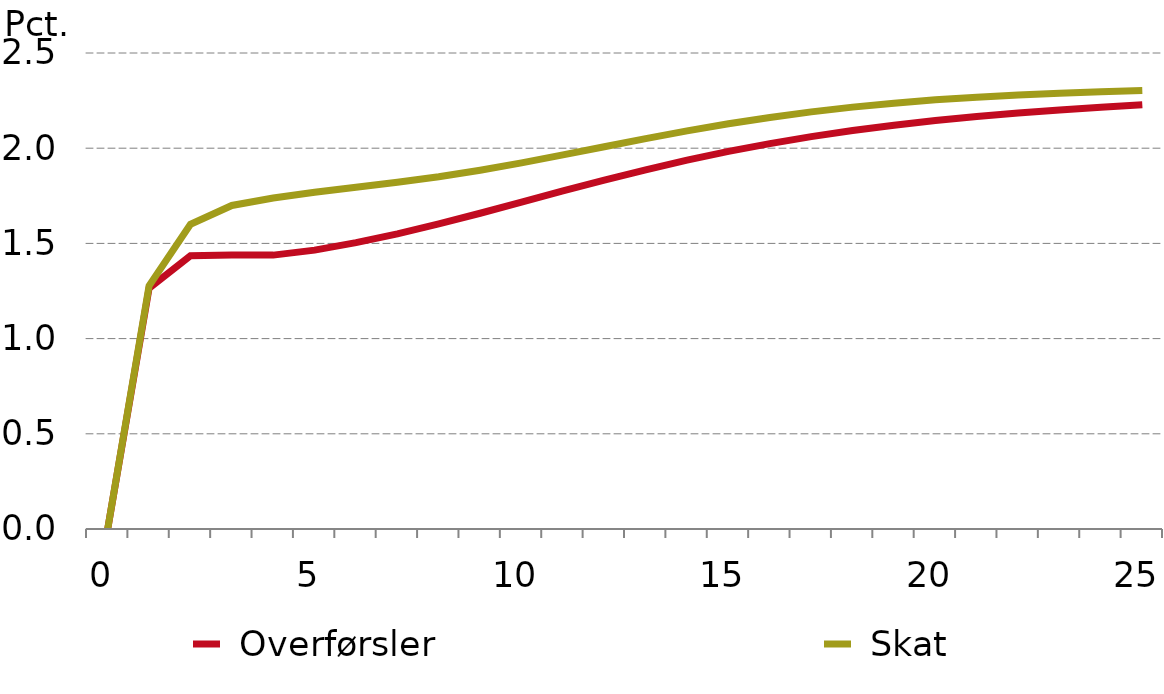
| Category |  Overførsler |  Skat |
|---|---|---|
| 0.0 | 0 | 0 |
| nan | 1.264 | 1.277 |
| nan | 1.436 | 1.601 |
| nan | 1.439 | 1.699 |
| nan | 1.439 | 1.738 |
| 5.0 | 1.464 | 1.768 |
| nan | 1.504 | 1.795 |
| nan | 1.55 | 1.821 |
| nan | 1.602 | 1.85 |
| nan | 1.658 | 1.884 |
| 10.0 | 1.717 | 1.923 |
| nan | 1.775 | 1.965 |
| nan | 1.832 | 2.008 |
| nan | 1.887 | 2.05 |
| nan | 1.937 | 2.091 |
| 15.0 | 1.983 | 2.128 |
| nan | 2.024 | 2.161 |
| nan | 2.061 | 2.191 |
| nan | 2.093 | 2.216 |
| nan | 2.121 | 2.237 |
| 20.0 | 2.145 | 2.254 |
| nan | 2.166 | 2.268 |
| nan | 2.185 | 2.279 |
| nan | 2.201 | 2.289 |
| nan | 2.215 | 2.297 |
| 25.0 | 2.228 | 2.303 |